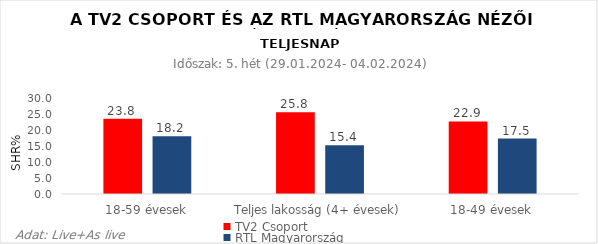
| Category | TV2 Csoport | RTL Magyarország |
|---|---|---|
| 18-59 évesek | 23.8 | 18.2 |
| Teljes lakosság (4+ évesek) | 25.8 | 15.4 |
| 18-49 évesek | 22.9 | 17.5 |